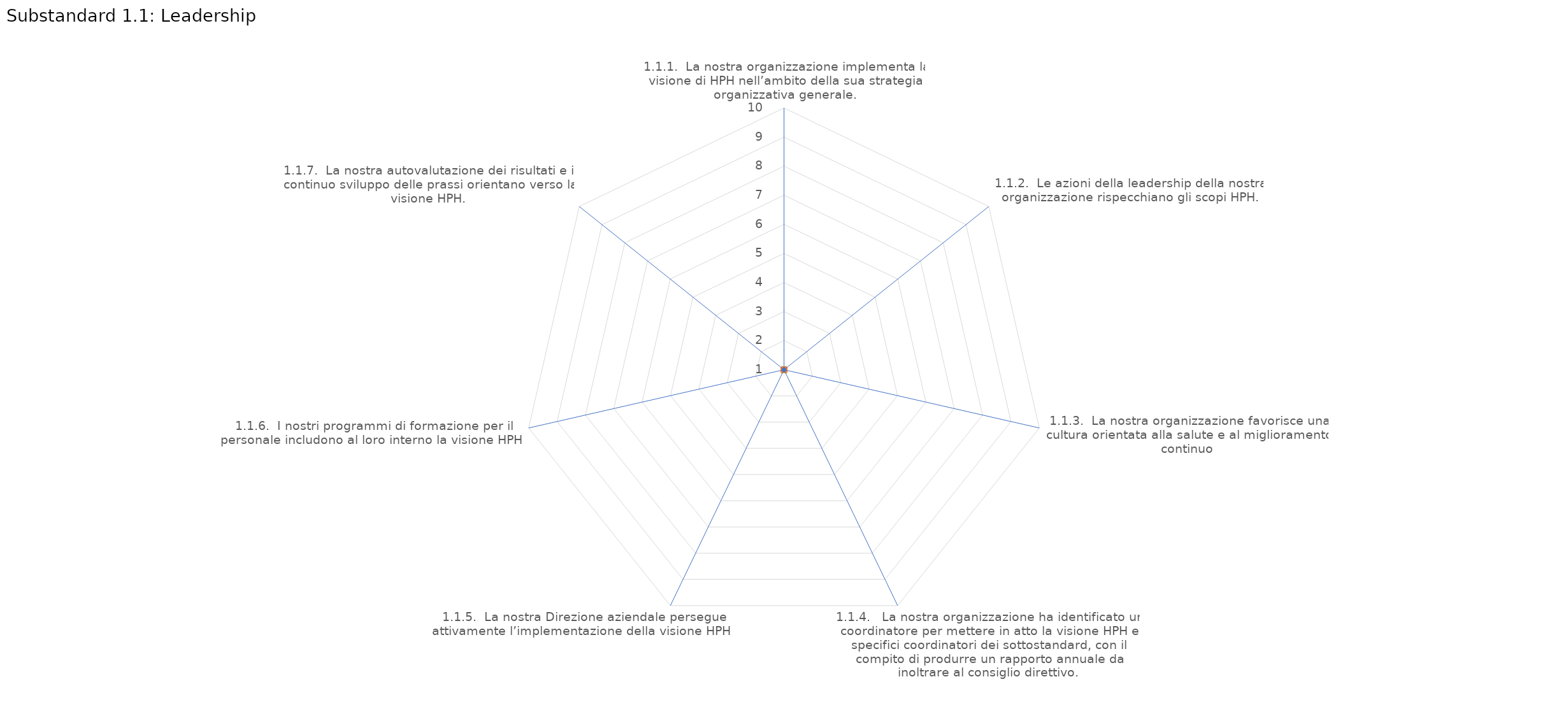
| Category | value |
|---|---|
| 1.1.1.  La nostra organizzazione implementa la visione di HPH nell’ambito della sua strategia organizzativa generale. | 1 |
| 1.1.2.  Le azioni della leadership della nostra organizzazione rispecchiano gli scopi HPH. | 1 |
| 1.1.3.  La nostra organizzazione favorisce una cultura orientata alla salute e al miglioramento continuo | 1 |
| 1.1.4.   La nostra organizzazione ha identificato un coordinatore per mettere in atto la visione HPH e specifici coordinatori dei sottostandard, con il compito di produrre un rapporto annuale da inoltrare al consiglio direttivo. | 1 |
| 1.1.5.  La nostra Direzione aziendale persegue attivamente l’implementazione della visione HPH. | 1 |
| 1.1.6.  I nostri programmi di formazione per il personale includono al loro interno la visione HPH. | 1 |
| 1.1.7.  La nostra autovalutazione dei risultati e il continuo sviluppo delle prassi orientano verso la visione HPH. | 1 |